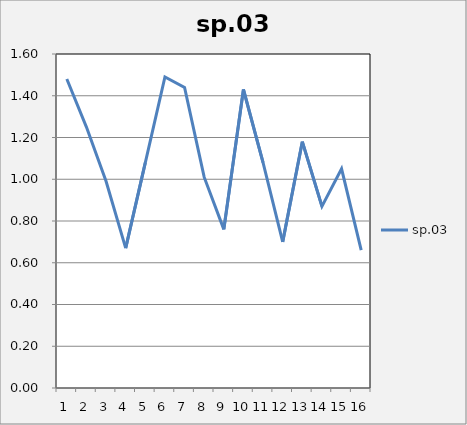
| Category | sp.03 |
|---|---|
| 0 | 1.48 |
| 1 | 1.25 |
| 2 | 0.99 |
| 3 | 0.67 |
| 4 | 1.08 |
| 5 | 1.49 |
| 6 | 1.44 |
| 7 | 1.01 |
| 8 | 0.76 |
| 9 | 1.43 |
| 10 | 1.08 |
| 11 | 0.7 |
| 12 | 1.18 |
| 13 | 0.87 |
| 14 | 1.05 |
| 15 | 0.66 |